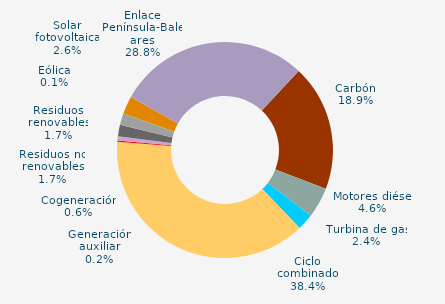
| Category | Series 0 |
|---|---|
| Carbón | 18.896 |
| Motores diésel | 4.588 |
| Turbina de gas | 2.429 |
| Ciclo combinado | 38.356 |
| Generación auxiliar | 0.201 |
| Cogeneración | 0.634 |
| Residuos no renovables | 1.695 |
| Residuos renovables | 1.695 |
| Eólica | 0.089 |
| Solar fotovoltaica | 2.617 |
| Otras renovables | 0.007 |
| Enlace Península-Baleares | 28.792 |